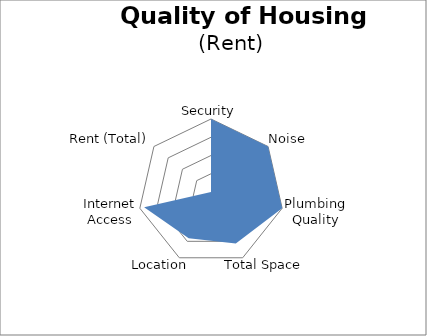
| Category | Rental Ranking |
|---|---|
| Security | 100 |
| Noise | 100 |
| Plumbing Quality | 100 |
| Total Space | 78.322 |
| Location | 70.469 |
| Internet Access | 93.962 |
| Rent (Total) | 0 |